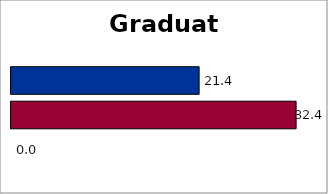
| Category | Series 2 | SREB states | 50 states and D.C. |
|---|---|---|---|
| 0 | 0 | 32.399 | 21.377 |